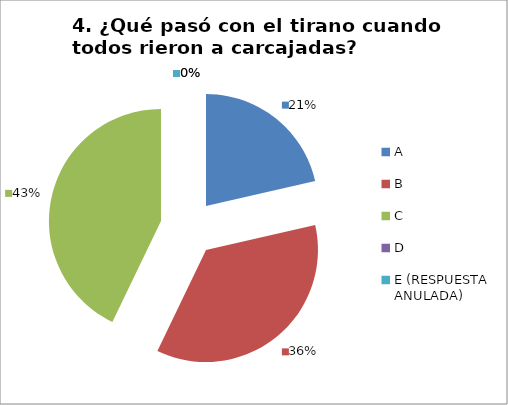
| Category | CANTIDAD DE RESPUESTAS PREGUNTA (4) | PORCENTAJE |
|---|---|---|
| A | 6 | 0.214 |
| B | 10 | 0.357 |
| C | 12 | 0.429 |
| D | 0 | 0 |
| E (RESPUESTA ANULADA) | 0 | 0 |